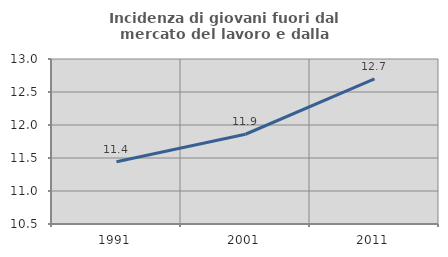
| Category | Incidenza di giovani fuori dal mercato del lavoro e dalla formazione  |
|---|---|
| 1991.0 | 11.443 |
| 2001.0 | 11.86 |
| 2011.0 | 12.698 |